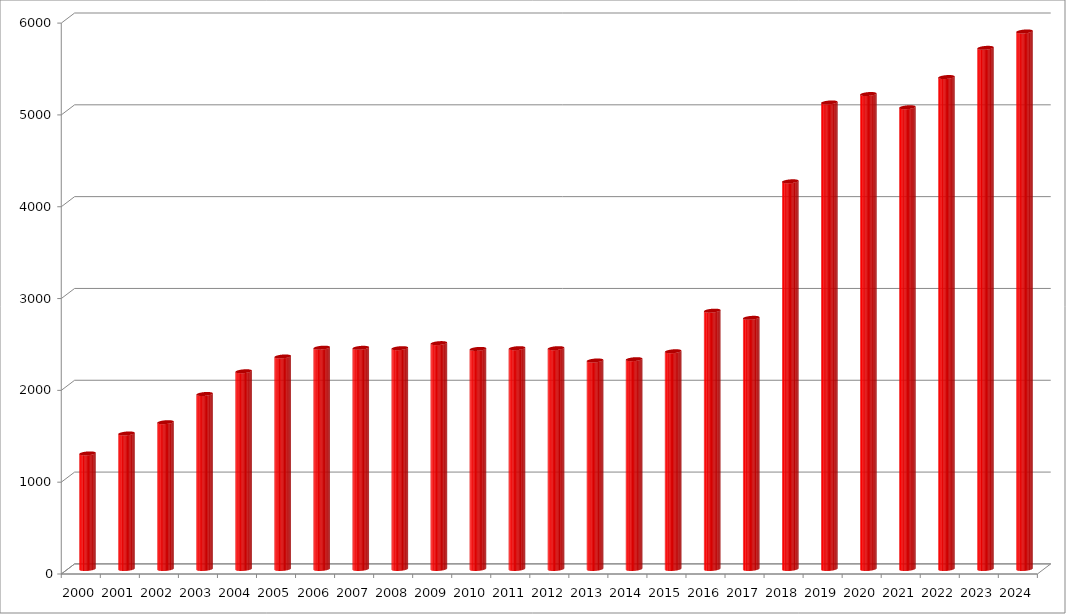
| Category | Series 0 |
|---|---|
| 2000.0 | 1258.5 |
| 2001.0 | 1475.5 |
| 2002.0 | 1598.5 |
| 2003.0 | 1905.5 |
| 2004.0 | 2153 |
| 2005.0 | 2314 |
| 2006.0 | 2410 |
| 2007.0 | 2408.5 |
| 2008.0 | 2404.5 |
| 2009.0 | 2459.5 |
| 2010.0 | 2396.5 |
| 2011.0 | 2404.5 |
| 2012.0 | 2404.5 |
| 2013.0 | 2270.5 |
| 2014.0 | 2284.5 |
| 2015.0 | 2371 |
| 2016.0 | 2813 |
| 2017.0 | 2735 |
| 2018.0 | 4222 |
| 2019.0 | 5081 |
| 2020.0 | 5172.5 |
| 2021.0 | 5028.5 |
| 2022.0 | 5357.5 |
| 2023.0 | 5675.5 |
| 2024.0 | 5854 |